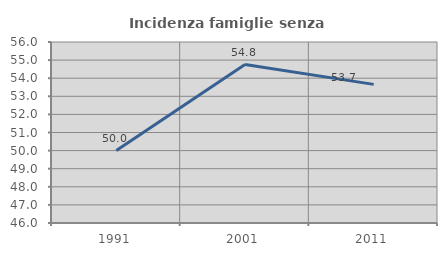
| Category | Incidenza famiglie senza nuclei |
|---|---|
| 1991.0 | 50 |
| 2001.0 | 54.751 |
| 2011.0 | 53.659 |